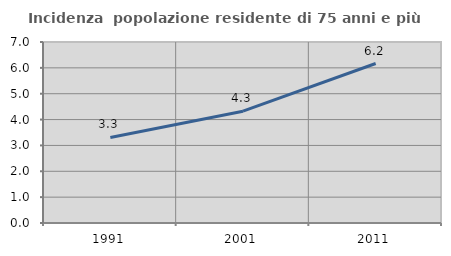
| Category | Incidenza  popolazione residente di 75 anni e più |
|---|---|
| 1991.0 | 3.31 |
| 2001.0 | 4.323 |
| 2011.0 | 6.168 |